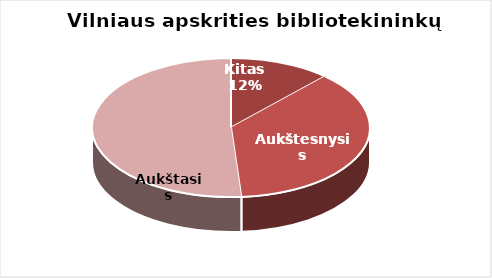
| Category | Series 0 |
|---|---|
| Kitas | 45 |
| Aukštesnysis | 141 |
| Aukštasis | 195 |